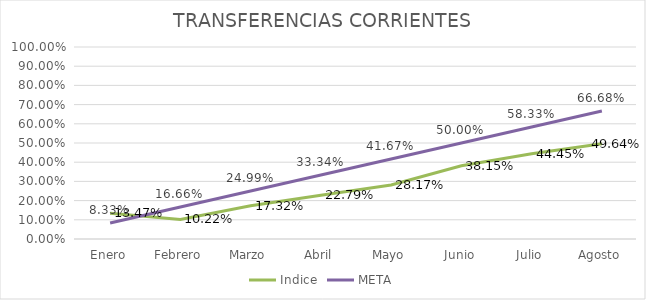
| Category | Indice | META |
|---|---|---|
| Enero | 0.135 | 0.083 |
| Febrero | 0.102 | 0.167 |
| Marzo | 0.173 | 0.25 |
| Abril | 0.228 | 0.333 |
| Mayo | 0.282 | 0.417 |
| Junio | 0.382 | 0.5 |
| Julio | 0.444 | 0.583 |
| Agosto | 0.496 | 0.667 |